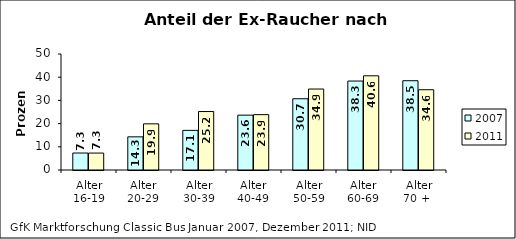
| Category | 2007 | 2011 |
|---|---|---|
| Alter
16-19 | 7.317 | 7.3 |
| Alter
20-29 | 14.286 | 19.9 |
| Alter
30-39 | 17.081 | 25.2 |
| Alter
40-49 | 23.641 | 23.858 |
| Alter
50-59 | 30.717 | 34.9 |
| Alter
60-69 | 38.344 | 40.6 |
| Alter
70 +  | 38.487 | 34.6 |